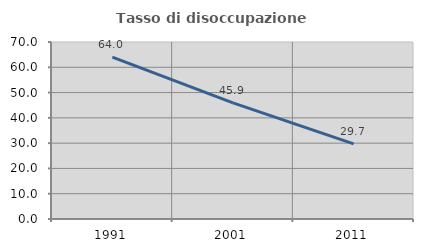
| Category | Tasso di disoccupazione giovanile  |
|---|---|
| 1991.0 | 64 |
| 2001.0 | 45.946 |
| 2011.0 | 29.73 |